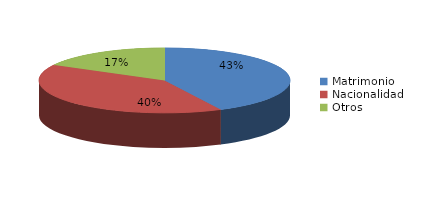
| Category | Series 0 |
|---|---|
| Matrimonio | 1804 |
| Nacionalidad | 1705 |
| Otros | 722 |